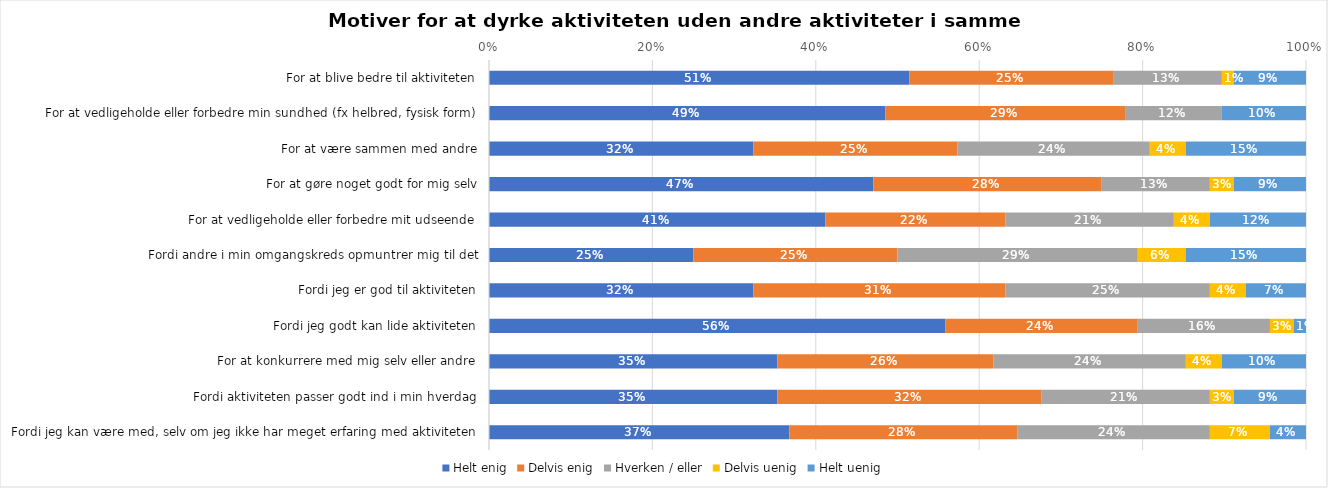
| Category | Helt enig | Delvis enig | Hverken / eller | Delvis uenig | Helt uenig |
|---|---|---|---|---|---|
| For at blive bedre til aktiviteten | 0.515 | 0.25 | 0.132 | 0.015 | 0.088 |
| For at vedligeholde eller forbedre min sundhed (fx helbred, fysisk form) | 0.485 | 0.294 | 0.118 | 0 | 0.103 |
| For at være sammen med andre | 0.324 | 0.25 | 0.235 | 0.044 | 0.147 |
| For at gøre noget godt for mig selv | 0.471 | 0.279 | 0.132 | 0.029 | 0.088 |
| For at vedligeholde eller forbedre mit udseende | 0.412 | 0.221 | 0.206 | 0.044 | 0.118 |
| Fordi andre i min omgangskreds opmuntrer mig til det | 0.25 | 0.25 | 0.294 | 0.059 | 0.147 |
| Fordi jeg er god til aktiviteten | 0.324 | 0.309 | 0.25 | 0.044 | 0.074 |
| Fordi jeg godt kan lide aktiviteten | 0.559 | 0.235 | 0.162 | 0.029 | 0.015 |
| For at konkurrere med mig selv eller andre | 0.353 | 0.265 | 0.235 | 0.044 | 0.103 |
| Fordi aktiviteten passer godt ind i min hverdag | 0.353 | 0.324 | 0.206 | 0.029 | 0.088 |
| Fordi jeg kan være med, selv om jeg ikke har meget erfaring med aktiviteten | 0.368 | 0.279 | 0.235 | 0.074 | 0.044 |